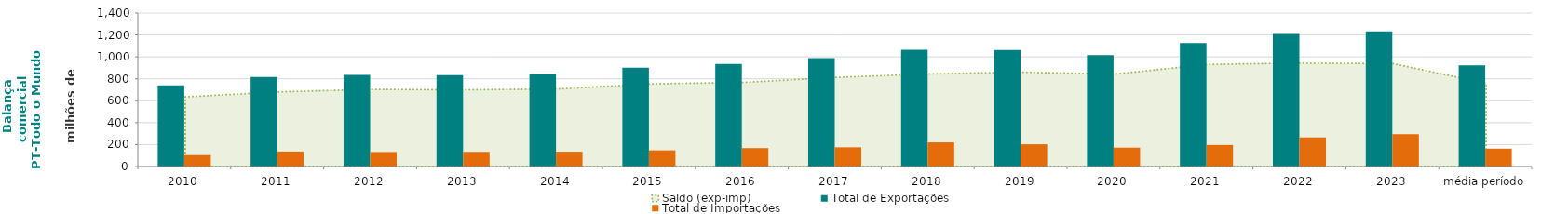
| Category | Total de Exportações  | Total de Importações  |
|---|---|---|
| 2010 | 739.381 | 104.282 |
| 2011 | 817.035 | 136.688 |
| 2012 | 835.816 | 132.304 |
| 2013 | 833.695 | 133.688 |
| 2014 | 841.785 | 135.004 |
| 2015 | 901.525 | 147.483 |
| 2016 | 934.836 | 167.809 |
| 2017 | 988.036 | 175.229 |
| 2018 | 1064.655 | 220.102 |
| 2019 | 1063.721 | 202.823 |
| 2020 | 1015.29 | 172.041 |
| 2021 | 1127.209 | 196.422 |
| 2022 | 1209.008 | 265.428 |
| 2023 | 1232.561 | 294.538 |
| média período | 922.392 | 163.01 |